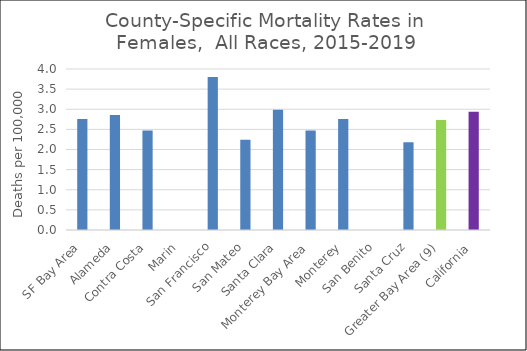
| Category | Female |
|---|---|
| SF Bay Area | 2.76 |
|   Alameda | 2.86 |
|   Contra Costa | 2.47 |
|   Marin | 0 |
|   San Francisco | 3.8 |
|   San Mateo | 2.24 |
|   Santa Clara | 2.99 |
| Monterey Bay Area | 2.47 |
|   Monterey | 2.76 |
|   San Benito | 0 |
|   Santa Cruz | 2.18 |
| Greater Bay Area (9) | 2.73 |
| California | 2.94 |